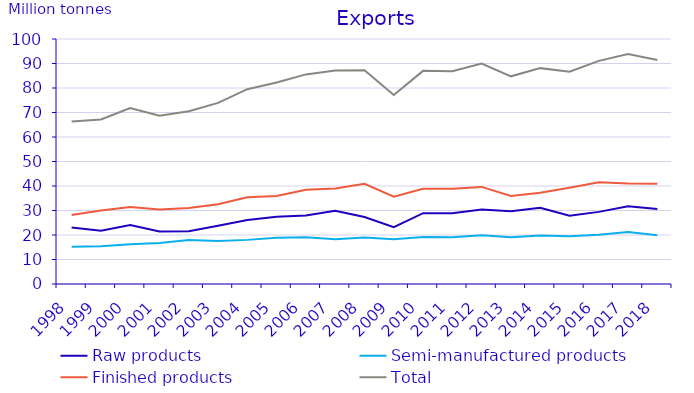
| Category | Raw products | Semi-manufactured products | Finished products | Total |
|---|---|---|---|---|
| 1998.0 | 23.014 | 15.225 | 28.118 | 66.356 |
| 1999.0 | 21.768 | 15.418 | 29.983 | 67.169 |
| 2000.0 | 24.092 | 16.259 | 31.435 | 71.786 |
| 2001.0 | 21.458 | 16.744 | 30.44 | 68.642 |
| 2002.0 | 21.553 | 17.952 | 30.983 | 70.488 |
| 2003.0 | 23.794 | 17.523 | 32.59 | 73.906 |
| 2004.0 | 26.099 | 18.01 | 35.421 | 79.53 |
| 2005.0 | 27.44 | 18.905 | 35.877 | 82.222 |
| 2006.0 | 28.008 | 19.074 | 38.469 | 85.551 |
| 2007.0 | 29.901 | 18.267 | 38.976 | 87.144 |
| 2008.0 | 27.364 | 18.951 | 40.893 | 87.208 |
| 2009.0 | 23.233 | 18.287 | 35.626 | 77.145 |
| 2010.0 | 28.899 | 19.203 | 38.89 | 86.992 |
| 2011.0 | 28.913 | 19.112 | 38.848 | 86.873 |
| 2012.0 | 30.4 | 19.907 | 39.63 | 89.938 |
| 2013.0 | 29.709 | 19.106 | 35.945 | 84.76 |
| 2014.0 | 31.1 | 19.806 | 37.203 | 88.109 |
| 2015.0 | 27.91 | 19.502 | 39.273 | 86.686 |
| 2016.0 | 29.44 | 20.124 | 41.517 | 91.081 |
| 2017.0 | 31.692 | 21.176 | 41.047 | 93.916 |
| 2018.0 | 30.592 | 19.901 | 40.94 | 91.433 |